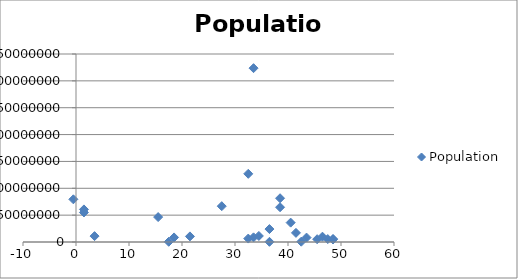
| Category | Population |
|---|---|
| 36.5 | 24104700 |
| 33.5 | 8662588 |
| 34.5 | 11250585 |
| 40.5 | 36048521 |
| 48.5 | 5707251 |
| 47.5 | 5488543 |
| 27.5 | 66689000 |
| 38.5 | 81459000 |
| 3.5 | 10955000 |
| 36.5 | 332529 |
| 32.5 | 6378000 |
| 18.5 | 8502900 |
| 1.5 | 60674003 |
| 32.5 | 126919659 |
| 42.5 | 562958 |
| 17.5 | 445426 |
| 41.5 | 17000059 |
| 48.5 | 4691480 |
| 45.5 | 5214900 |
| 21.5 | 10427301 |
| 1.5 | 54956900 |
| 15.5 | 46423064 |
| 46.5 | 9875378 |
| 43.5 | 8211700 |
| -0.5 | 79463663 |
| 38.5 | 64716000 |
| 33.5 | 323625762 |